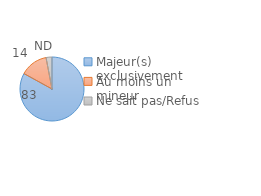
| Category | Series 0 |
|---|---|
| Majeur(s) exclusivement | 83 |
| Au moins un mineur | 14 |
| Ne sait pas/Refus | 3 |